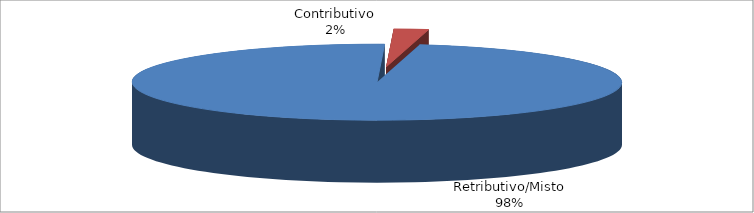
| Category | Series 1 |
|---|---|
| Retributivo/Misto | 131118 |
| Contributivo | 3065 |